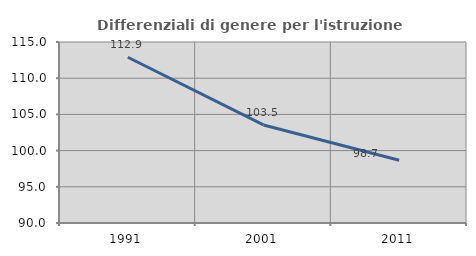
| Category | Differenziali di genere per l'istruzione superiore |
|---|---|
| 1991.0 | 112.894 |
| 2001.0 | 103.544 |
| 2011.0 | 98.659 |